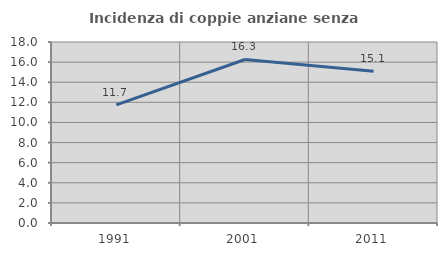
| Category | Incidenza di coppie anziane senza figli  |
|---|---|
| 1991.0 | 11.747 |
| 2001.0 | 16.261 |
| 2011.0 | 15.099 |